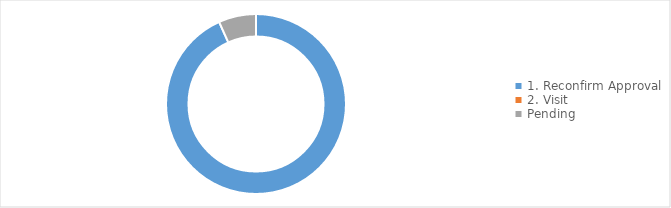
| Category | 2017-18 |
|---|---|
| 1. Reconfirm Approval | 0.933 |
| 2. Visit | 0 |
| Pending  | 0.067 |